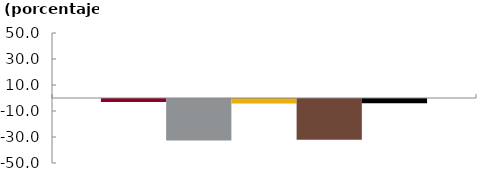
| Category | Bancos | CF | CFC | Coop | Sistema |
|---|---|---|---|---|---|
|  | -2.324 | -31.939 | -3.382 | -31.286 | -3.187 |